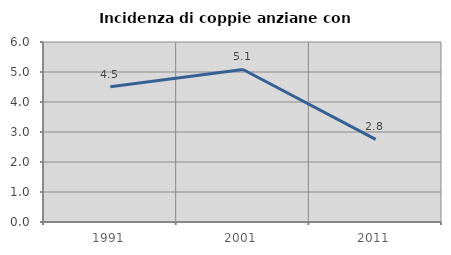
| Category | Incidenza di coppie anziane con figli |
|---|---|
| 1991.0 | 4.511 |
| 2001.0 | 5.085 |
| 2011.0 | 2.752 |